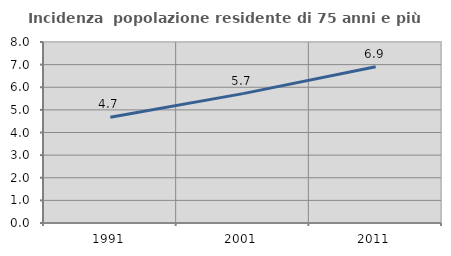
| Category | Incidenza  popolazione residente di 75 anni e più |
|---|---|
| 1991.0 | 4.671 |
| 2001.0 | 5.718 |
| 2011.0 | 6.905 |